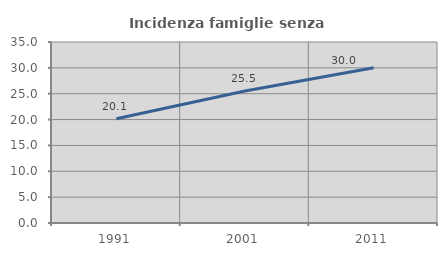
| Category | Incidenza famiglie senza nuclei |
|---|---|
| 1991.0 | 20.142 |
| 2001.0 | 25.525 |
| 2011.0 | 30.027 |